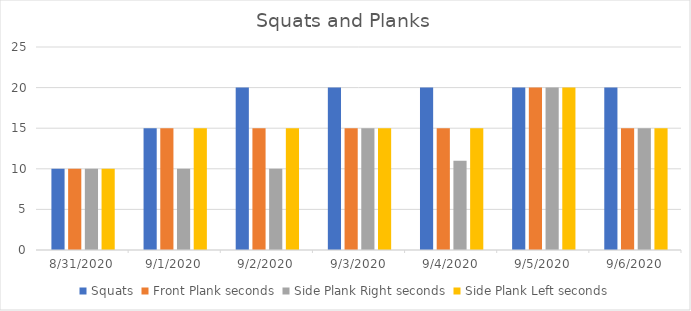
| Category | Squats | Front Plank seconds | Side Plank Right seconds | Side Plank Left seconds |
|---|---|---|---|---|
| 8/31/20 | 10 | 10 | 10 | 10 |
| 9/1/20 | 15 | 15 | 10 | 15 |
| 9/2/20 | 20 | 15 | 10 | 15 |
| 9/3/20 | 20 | 15 | 15 | 15 |
| 9/4/20 | 20 | 15 | 11 | 15 |
| 9/5/20 | 20 | 20 | 20 | 20 |
| 9/6/20 | 20 | 15 | 15 | 15 |